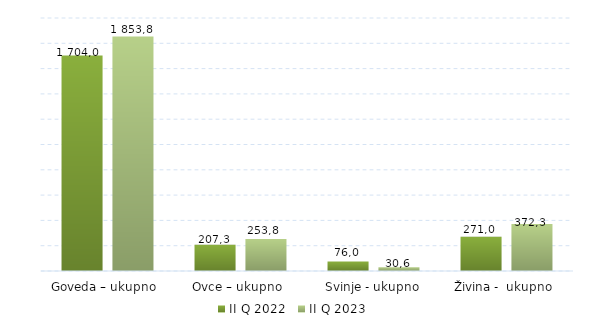
| Category | II Q 2022 | II Q 2023 |
|---|---|---|
| Goveda – ukupno  | 1704 | 1853.8 |
| Ovce – ukupno  | 207.3 | 253.8 |
| Svinje - ukupno | 75.963 | 30.6 |
| Živina -  ukupno  | 271 | 372.3 |